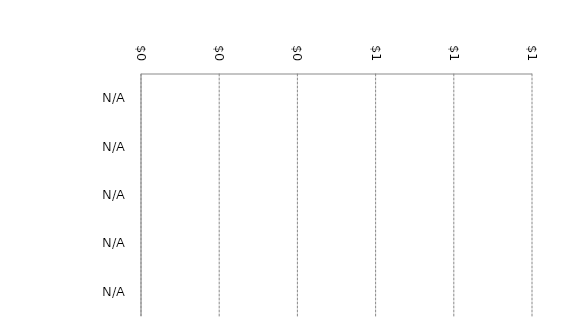
| Category | Series 1 | Series 0 |
|---|---|---|
| N/A | 0 | 0 |
| N/A | 0 | 0 |
| N/A | 0 | 0 |
| N/A | 0 | 0 |
| N/A | 0 | 0 |